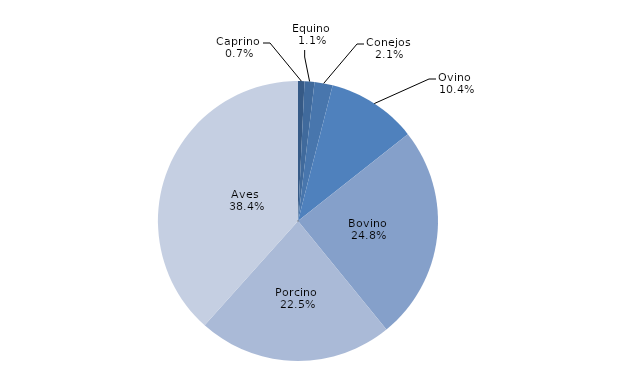
| Category | Series 0 |
|---|---|
| Caprino  | 688.06 |
| Equino  | 1056.95 |
| Conejos  | 1929.4 |
| Ovino  | 9559.98 |
| Bovino  | 22838.4 |
| Porcino  | 20753.13 |
| Aves  | 35393.76 |